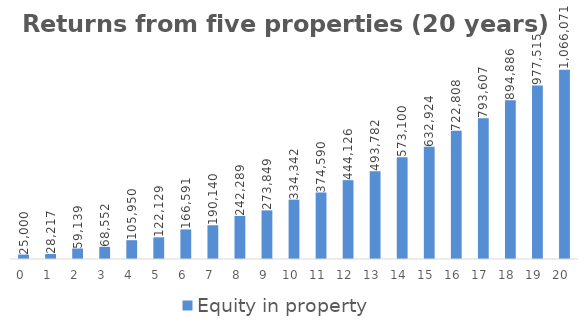
| Category | Equity in property  | Total equity  |
|---|---|---|
| 0.0 | 25000 | 25000 |
| 1.0 | 28217.328 | 28217.328 |
| 2.0 | 59138.954 | 59138.954 |
| 3.0 | 68551.653 | 68551.653 |
| 4.0 | 105949.94 | 105949.94 |
| 5.0 | 122128.756 | 122128.756 |
| 6.0 | 166591.028 | 166591.028 |
| 7.0 | 190140.363 | 190140.363 |
| 8.0 | 242288.619 | 242288.619 |
| 9.0 | 273848.605 | 273848.605 |
| 10.0 | 334341.661 | 334341.661 |
| 11.0 | 374590.369 | 374590.369 |
| 12.0 | 444126.142 | 444126.142 |
| 13.0 | 493781.939 | 493781.939 |
| 14.0 | 573099.87 | 573099.87 |
| 15.0 | 632923.922 | 632923.922 |
| 16.0 | 722807.571 | 722807.571 |
| 17.0 | 793606.52 | 793606.52 |
| 18.0 | 894886.321 | 894886.321 |
| 19.0 | 977515.13 | 977515.13 |
| 20.0 | 1066071.336 | 1066071.336 |